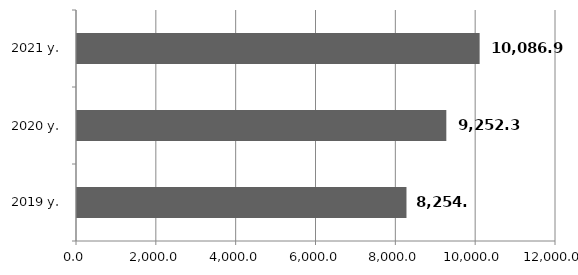
| Category | Series 0 |
|---|---|
| 2019 y. | 8254.3 |
| 2020 y. | 9252.3 |
| 2021 y. | 10086.9 |